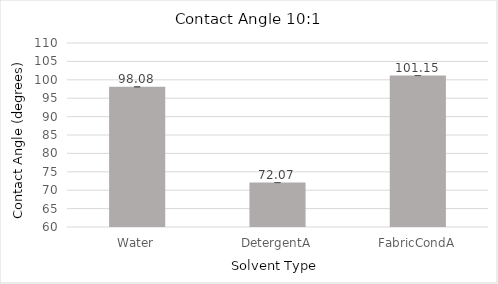
| Category | Series 0 |
|---|---|
| Water | 98.083 |
| DetergentA | 72.07 |
| FabricCondA | 101.15 |